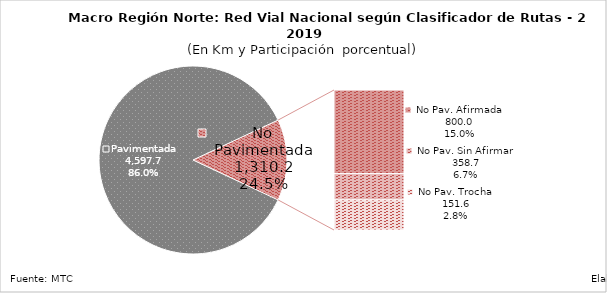
| Category | Series 0 |
|---|---|
| Pavimentada | 4597.713 |
| No Pavimentada                   Afirmada | 445.575 |
| No Pavimentada                   Sin Afirmar | 140.323 |
| No Pavimentada                            Trocha | 160.262 |